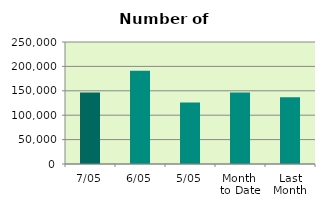
| Category | Series 0 |
|---|---|
| 7/05 | 146264 |
| 6/05 | 191188 |
| 5/05 | 125872 |
| Month 
to Date | 146687.2 |
| Last
Month | 137031.8 |